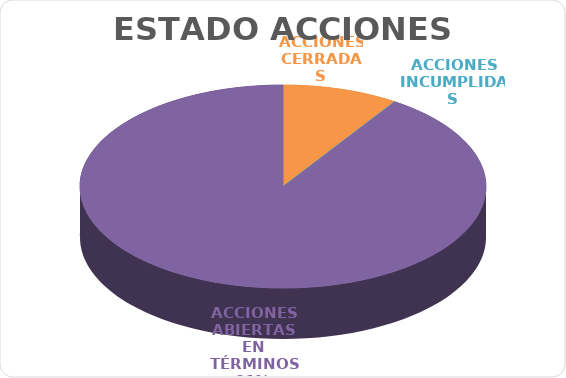
| Category | Series 0 |
|---|---|
| ACCIONES CERRADAS | 5 |
| ACCIONES INCUMPLIDAS | 0 |
| ACCIONES ABIERTAS EN TÉRMINOS | 49 |